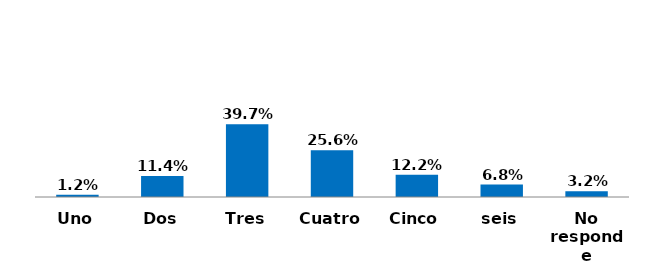
| Category | Series 0 |
|---|---|
| Uno | 0.012 |
| Dos | 0.114 |
| Tres | 0.397 |
| Cuatro | 0.256 |
| Cinco | 0.122 |
| seis | 0.068 |
| No responde | 0.032 |